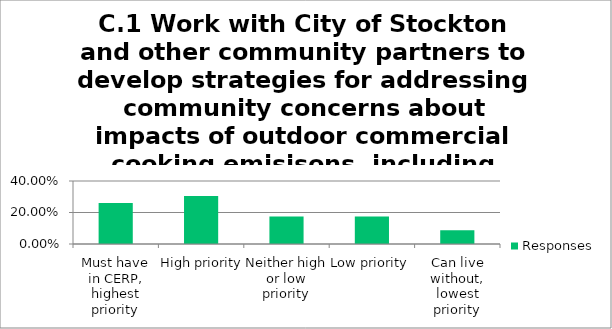
| Category | Responses |
|---|---|
| Must have in CERP, highest priority | 0.261 |
| High priority | 0.304 |
| Neither high or low priority | 0.174 |
| Low priority | 0.174 |
| Can live without, lowest priority | 0.087 |